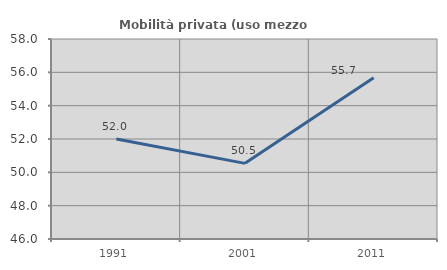
| Category | Mobilità privata (uso mezzo privato) |
|---|---|
| 1991.0 | 52 |
| 2001.0 | 50.538 |
| 2011.0 | 55.67 |